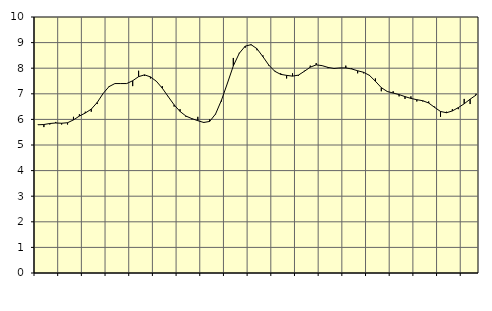
| Category | Piggar | Series 1 |
|---|---|---|
| nan | 5.8 | 5.79 |
| 1.0 | 5.7 | 5.8 |
| 1.0 | 5.8 | 5.84 |
| 1.0 | 5.9 | 5.86 |
| nan | 5.8 | 5.85 |
| 2.0 | 5.8 | 5.87 |
| 2.0 | 6.1 | 5.98 |
| 2.0 | 6.2 | 6.13 |
| nan | 6.3 | 6.25 |
| 3.0 | 6.3 | 6.4 |
| 3.0 | 6.6 | 6.66 |
| 3.0 | 7 | 7.01 |
| nan | 7.3 | 7.28 |
| 4.0 | 7.4 | 7.4 |
| 4.0 | 7.4 | 7.4 |
| 4.0 | 7.4 | 7.4 |
| nan | 7.3 | 7.51 |
| 5.0 | 7.9 | 7.67 |
| 5.0 | 7.7 | 7.74 |
| 5.0 | 7.6 | 7.66 |
| nan | 7.5 | 7.49 |
| 6.0 | 7.3 | 7.22 |
| 6.0 | 6.9 | 6.89 |
| 6.0 | 6.5 | 6.57 |
| nan | 6.4 | 6.31 |
| 7.0 | 6.1 | 6.13 |
| 7.0 | 6 | 6.03 |
| 7.0 | 6.1 | 5.95 |
| nan | 5.9 | 5.88 |
| 8.0 | 6 | 5.92 |
| 8.0 | 6.2 | 6.21 |
| 8.0 | 6.7 | 6.75 |
| nan | 7.4 | 7.41 |
| 9.0 | 8.4 | 8.09 |
| 9.0 | 8.6 | 8.58 |
| 9.0 | 8.8 | 8.86 |
| nan | 8.9 | 8.92 |
| 10.0 | 8.7 | 8.76 |
| 10.0 | 8.5 | 8.45 |
| 10.0 | 8.1 | 8.12 |
| nan | 7.9 | 7.88 |
| 11.0 | 7.8 | 7.76 |
| 11.0 | 7.6 | 7.72 |
| 11.0 | 7.8 | 7.69 |
| nan | 7.7 | 7.73 |
| 12.0 | 7.9 | 7.88 |
| 12.0 | 8.1 | 8.04 |
| 12.0 | 8.2 | 8.13 |
| nan | 8.1 | 8.1 |
| 13.0 | 8 | 8.03 |
| 13.0 | 8 | 7.99 |
| 13.0 | 8 | 8.01 |
| nan | 8.1 | 8.01 |
| 14.0 | 8 | 7.97 |
| 14.0 | 7.8 | 7.9 |
| 14.0 | 7.8 | 7.84 |
| nan | 7.7 | 7.72 |
| 15.0 | 7.6 | 7.49 |
| 15.0 | 7.1 | 7.24 |
| 15.0 | 7.1 | 7.09 |
| nan | 7.1 | 7.03 |
| 16.0 | 6.9 | 6.97 |
| 16.0 | 6.8 | 6.89 |
| 16.0 | 6.9 | 6.82 |
| nan | 6.7 | 6.77 |
| 17.0 | 6.7 | 6.73 |
| 17.0 | 6.7 | 6.64 |
| 17.0 | 6.5 | 6.47 |
| nan | 6.1 | 6.31 |
| 18.0 | 6.3 | 6.26 |
| 18.0 | 6.4 | 6.33 |
| 18.0 | 6.4 | 6.46 |
| nan | 6.8 | 6.61 |
| 19.0 | 6.6 | 6.79 |
| 19.0 | 7 | 6.95 |